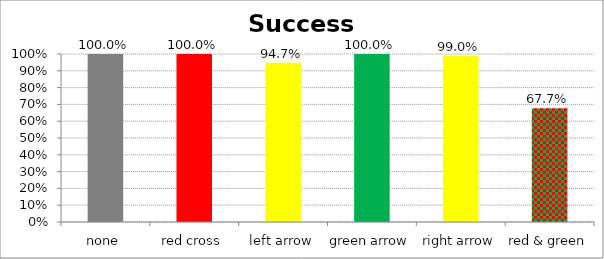
| Category | Success Rate |
|---|---|
| none | 1 |
| red cross | 1 |
| left arrow | 0.947 |
| green arrow | 1 |
| right arrow | 0.99 |
| red & green | 0.677 |